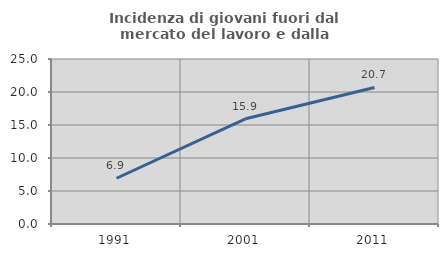
| Category | Incidenza di giovani fuori dal mercato del lavoro e dalla formazione  |
|---|---|
| 1991.0 | 6.931 |
| 2001.0 | 15.942 |
| 2011.0 | 20.69 |